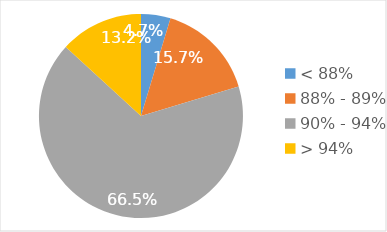
| Category | Доля, % |
|---|---|
| < 88% | 0.047 |
| 88% - 89% | 0.157 |
| 90% - 94% | 0.665 |
| > 94% | 0.132 |